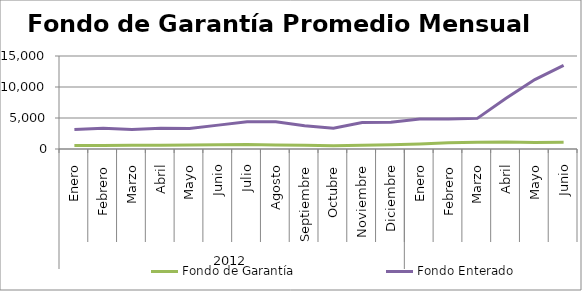
| Category | Fondo de Garantía | Fondo Enterado |
|---|---|---|
| 0 | 560.173 | 3141.641 |
| 1 | 575.916 | 3362.648 |
| 2 | 622.075 | 3154.118 |
| 3 | 612.299 | 3348.058 |
| 4 | 654.277 | 3308.859 |
| 5 | 675.965 | 3850.375 |
| 6 | 729.97 | 4400.539 |
| 7 | 649.095 | 4383.327 |
| 8 | 606.03 | 3757.632 |
| 9 | 525.314 | 3362.932 |
| 10 | 591.646 | 4285.609 |
| 11 | 703.403 | 4296.87 |
| 12 | 823.344 | 4842.786 |
| 13 | 1008.855 | 4845.136 |
| 14 | 1091.101 | 4938.365 |
| 15 | 1128.09 | 8179.666 |
| 16 | 1047.818 | 11202.213 |
| 17 | 1079.154 | 13493.433 |